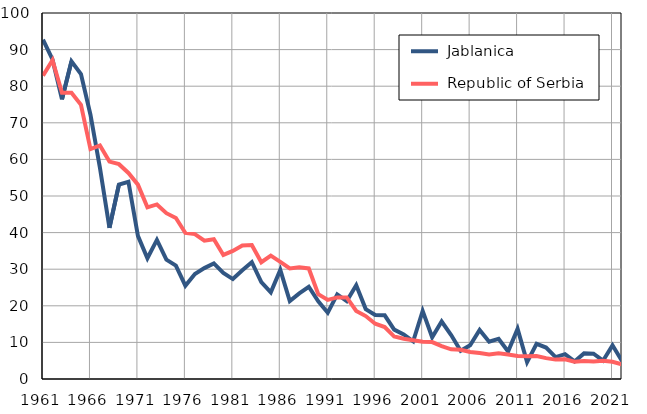
| Category |  Jablanica |  Republic of Serbia |
|---|---|---|
| 1961.0 | 92.7 | 82.9 |
| 1962.0 | 87.3 | 87.1 |
| 1963.0 | 76.4 | 78.2 |
| 1964.0 | 86.8 | 78.2 |
| 1965.0 | 83.3 | 74.9 |
| 1966.0 | 72.2 | 62.8 |
| 1967.0 | 57.7 | 63.8 |
| 1968.0 | 41.3 | 59.4 |
| 1969.0 | 53.1 | 58.7 |
| 1970.0 | 53.9 | 56.3 |
| 1971.0 | 39.1 | 53.1 |
| 1972.0 | 33 | 46.9 |
| 1973.0 | 38 | 47.7 |
| 1974.0 | 32.6 | 45.3 |
| 1975.0 | 31 | 44 |
| 1976.0 | 25.5 | 39.9 |
| 1977.0 | 28.7 | 39.6 |
| 1978.0 | 30.3 | 37.8 |
| 1979.0 | 31.6 | 38.2 |
| 1980.0 | 29 | 33.9 |
| 1981.0 | 27.3 | 35 |
| 1982.0 | 29.7 | 36.5 |
| 1983.0 | 31.9 | 36.6 |
| 1984.0 | 26.5 | 31.9 |
| 1985.0 | 23.7 | 33.7 |
| 1986.0 | 29.8 | 32 |
| 1987.0 | 21.3 | 30.2 |
| 1988.0 | 23.4 | 30.5 |
| 1989.0 | 25.2 | 30.2 |
| 1990.0 | 21.2 | 23.2 |
| 1991.0 | 18.1 | 21.6 |
| 1992.0 | 23.1 | 22.3 |
| 1993.0 | 21.3 | 22.3 |
| 1994.0 | 25.6 | 18.6 |
| 1995.0 | 19.1 | 17.2 |
| 1996.0 | 17.5 | 15.1 |
| 1997.0 | 17.4 | 14.2 |
| 1998.0 | 13.5 | 11.6 |
| 1999.0 | 12.2 | 11 |
| 2000.0 | 10.3 | 10.6 |
| 2001.0 | 18.6 | 10.2 |
| 2002.0 | 11.4 | 10.1 |
| 2003.0 | 15.7 | 9 |
| 2004.0 | 12 | 8.1 |
| 2005.0 | 7.7 | 8 |
| 2006.0 | 9.2 | 7.4 |
| 2007.0 | 13.4 | 7.1 |
| 2008.0 | 10.2 | 6.7 |
| 2009.0 | 11 | 7 |
| 2010.0 | 7.5 | 6.7 |
| 2011.0 | 13.7 | 6.3 |
| 2012.0 | 4.6 | 6.2 |
| 2013.0 | 9.6 | 6.3 |
| 2014.0 | 8.6 | 5.7 |
| 2015.0 | 6 | 5.3 |
| 2016.0 | 6.8 | 5.4 |
| 2017.0 | 4.8 | 4.7 |
| 2018.0 | 7 | 4.9 |
| 2019.0 | 6.9 | 4.8 |
| 2020.0 | 5 | 5 |
| 2021.0 | 9.2 | 4.7 |
| 2022.0 | 4.9 | 4 |